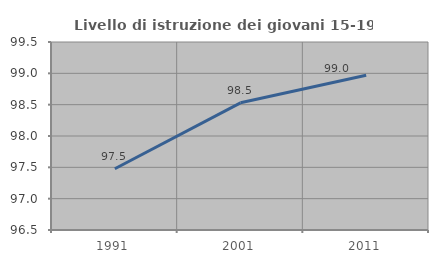
| Category | Livello di istruzione dei giovani 15-19 anni |
|---|---|
| 1991.0 | 97.477 |
| 2001.0 | 98.529 |
| 2011.0 | 98.969 |